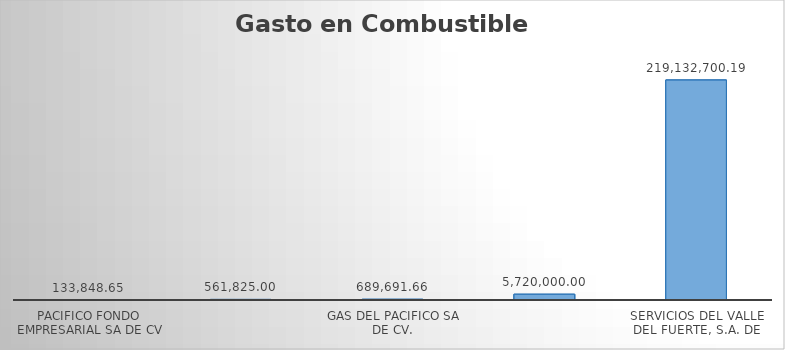
| Category | Suma |
|---|---|
| PACIFICO FONDO EMPRESARIAL SA DE CV | 133848.65 |
| COMBUSTIBLES Y LUBRICANTES DE LOS MOCHIS, S.A. DE C.V. | 561825 |
| GAS DEL PACIFICO SA DE CV. | 689691.66 |
| SERVICIOS DEL CERRO DE LA MEMORIA SA DE CV | 5720000 |
| SERVICIOS DEL VALLE DEL FUERTE, S.A. DE C.V. | 219132700.19 |